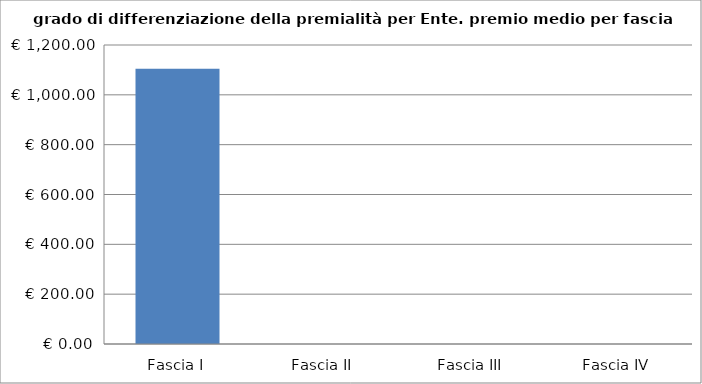
| Category | Totale ente |
|---|---|
| Fascia I | 1104.583 |
| Fascia II | 0 |
| Fascia III | 0 |
| Fascia IV | 0 |